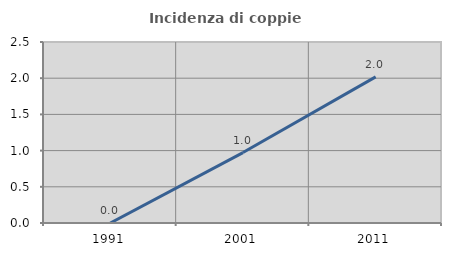
| Category | Incidenza di coppie miste |
|---|---|
| 1991.0 | 0 |
| 2001.0 | 0.973 |
| 2011.0 | 2.018 |